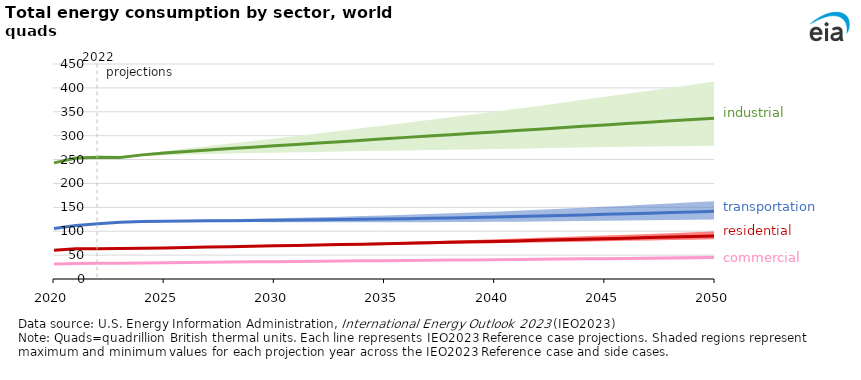
| Category | Series 38 | Series 1 | Series 8 | Series 9 | Series 16 | Series 23 | Series 31 | Series 39 | Series 46 | Series 53 | Series 54 |
|---|---|---|---|---|---|---|---|---|---|---|---|
| 2020.0 | 243.126 | 60.414 | 60.414 | 60.414 | 31.169 | 31.169 | 243.109 | 243.107 | 105.654 | 105.656 | 105.654 |
| 2021.0 | 253.256 | 63.183 | 63.183 | 63.183 | 32.575 | 32.575 | 253.25 | 253.231 | 112.074 | 112.078 | 112.074 |
| 2022.0 | 254.681 | 63.111 | 63.143 | 63.099 | 32.844 | 32.854 | 254.681 | 254.62 | 115.821 | 115.841 | 115.671 |
| 2023.0 | 255.431 | 63.66 | 63.803 | 63.535 | 33.158 | 33.212 | 254.126 | 253.762 | 118.583 | 118.938 | 117.544 |
| 2024.0 | 261.88 | 64.122 | 64.308 | 63.86 | 33.498 | 33.617 | 259.803 | 256.798 | 120.095 | 120.875 | 118.884 |
| 2025.0 | 267.632 | 65.068 | 65.372 | 64.701 | 34.041 | 34.25 | 263.929 | 258.981 | 120.793 | 122.211 | 119.222 |
| 2026.0 | 273.04 | 65.908 | 66.292 | 65.508 | 34.527 | 34.806 | 266.756 | 260.357 | 121.269 | 123.301 | 119.32 |
| 2027.0 | 278.36 | 66.832 | 67.364 | 66.236 | 34.978 | 35.356 | 269.846 | 261.464 | 121.667 | 124.254 | 119.273 |
| 2028.0 | 283.618 | 67.71 | 68.473 | 66.941 | 35.467 | 35.942 | 272.936 | 262.551 | 122.06 | 125.159 | 119.214 |
| 2029.0 | 288.882 | 68.616 | 69.605 | 67.6 | 35.924 | 36.504 | 275.918 | 263.473 | 122.486 | 126.13 | 119.116 |
| 2030.0 | 294.16 | 69.512 | 70.712 | 68.263 | 36.361 | 37.042 | 278.845 | 264.32 | 122.852 | 127.066 | 118.991 |
| 2031.0 | 299.34 | 70.353 | 71.813 | 68.893 | 36.763 | 37.561 | 281.612 | 265.053 | 123.281 | 128.079 | 118.923 |
| 2032.0 | 304.684 | 71.181 | 72.909 | 69.535 | 37.162 | 38.076 | 284.524 | 265.947 | 123.815 | 129.193 | 118.944 |
| 2033.0 | 310.174 | 72.046 | 74.058 | 70.144 | 37.553 | 38.586 | 287.483 | 266.819 | 124.431 | 130.418 | 119.004 |
| 2034.0 | 315.804 | 72.923 | 75.197 | 70.78 | 37.94 | 39.1 | 290.535 | 267.656 | 125.054 | 131.662 | 118.985 |
| 2035.0 | 321.466 | 73.806 | 76.412 | 71.403 | 38.318 | 39.63 | 293.482 | 268.369 | 125.694 | 132.992 | 118.956 |
| 2036.0 | 327.197 | 74.782 | 77.721 | 72.128 | 38.743 | 40.21 | 296.42 | 269.119 | 126.347 | 134.387 | 118.941 |
| 2037.0 | 332.917 | 75.73 | 79.074 | 72.854 | 39.155 | 40.785 | 299.282 | 269.854 | 127.061 | 135.874 | 119.01 |
| 2038.0 | 338.588 | 76.728 | 80.405 | 73.581 | 39.568 | 41.341 | 302.067 | 270.567 | 127.847 | 137.458 | 119.147 |
| 2039.0 | 344.276 | 77.708 | 81.778 | 74.292 | 39.971 | 41.912 | 304.886 | 271.235 | 128.665 | 139.099 | 119.329 |
| 2040.0 | 350.17 | 78.725 | 83.198 | 75.023 | 40.388 | 42.502 | 307.755 | 271.972 | 129.61 | 140.883 | 119.624 |
| 2041.0 | 356.222 | 79.785 | 84.648 | 75.793 | 40.81 | 43.098 | 310.724 | 272.773 | 130.601 | 142.745 | 119.923 |
| 2042.0 | 362.231 | 80.888 | 86.176 | 76.573 | 41.244 | 43.716 | 313.678 | 273.664 | 131.699 | 144.728 | 120.335 |
| 2043.0 | 368.458 | 82.017 | 87.746 | 77.39 | 41.684 | 44.351 | 316.588 | 274.562 | 132.85 | 146.812 | 120.804 |
| 2044.0 | 374.921 | 83.212 | 89.362 | 78.219 | 42.143 | 45.001 | 319.606 | 275.474 | 134.051 | 148.996 | 121.342 |
| 2045.0 | 381.41 | 84.38 | 91.024 | 79.035 | 42.588 | 45.657 | 322.551 | 276.241 | 135.279 | 151.244 | 121.894 |
| 2046.0 | 387.741 | 85.496 | 92.64 | 79.84 | 43.01 | 46.302 | 325.403 | 276.96 | 136.536 | 153.504 | 122.47 |
| 2047.0 | 394.058 | 86.645 | 94.262 | 80.615 | 43.449 | 46.956 | 328.279 | 277.378 | 137.837 | 155.81 | 123.036 |
| 2048.0 | 400.416 | 87.826 | 95.932 | 81.397 | 43.901 | 47.617 | 331.07 | 277.863 | 139.116 | 158.112 | 123.608 |
| 2049.0 | 406.765 | 88.99 | 97.622 | 82.212 | 44.346 | 48.286 | 333.788 | 278.281 | 140.393 | 160.478 | 124.188 |
| 2050.0 | 413.763 | 90.196 | 99.414 | 83.015 | 44.8 | 48.975 | 336.641 | 278.66 | 141.721 | 162.944 | 124.804 |